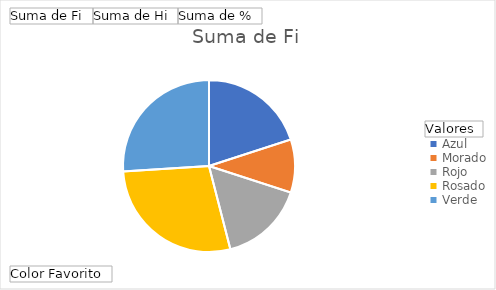
| Category | Suma de Fi | Suma de Hi | Suma de % |
|---|---|---|---|
| Azul | 10 | 0.2 | 0.2 |
| Morado | 5 | 0.1 | 0.1 |
| Rojo | 8 | 0.16 | 0.16 |
| Rosado | 14 | 0.28 | 0.28 |
| Verde | 13 | 0.26 | 0.26 |